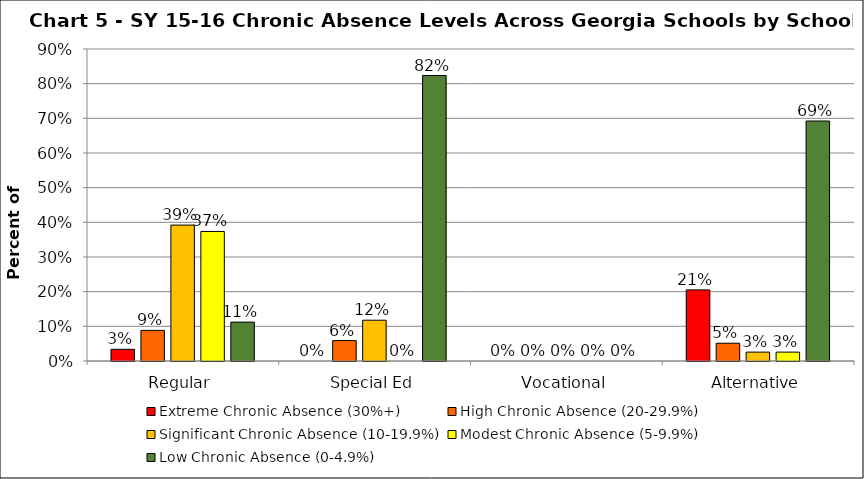
| Category | Extreme Chronic Absence (30%+) | High Chronic Absence (20-29.9%) | Significant Chronic Absence (10-19.9%) | Modest Chronic Absence (5-9.9%) | Low Chronic Absence (0-4.9%) |
|---|---|---|---|---|---|
| 0 | 0.034 | 0.088 | 0.392 | 0.374 | 0.112 |
| 1 | 0 | 0.059 | 0.118 | 0 | 0.824 |
| 2 | 0 | 0 | 0 | 0 | 0 |
| 3 | 0.205 | 0.051 | 0.026 | 0.026 | 0.692 |